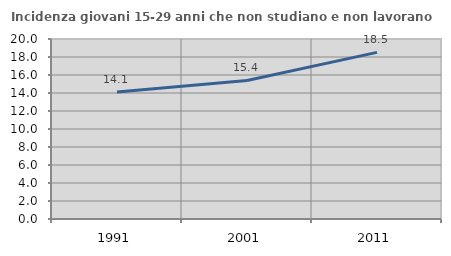
| Category | Incidenza giovani 15-29 anni che non studiano e non lavorano  |
|---|---|
| 1991.0 | 14.104 |
| 2001.0 | 15.396 |
| 2011.0 | 18.511 |